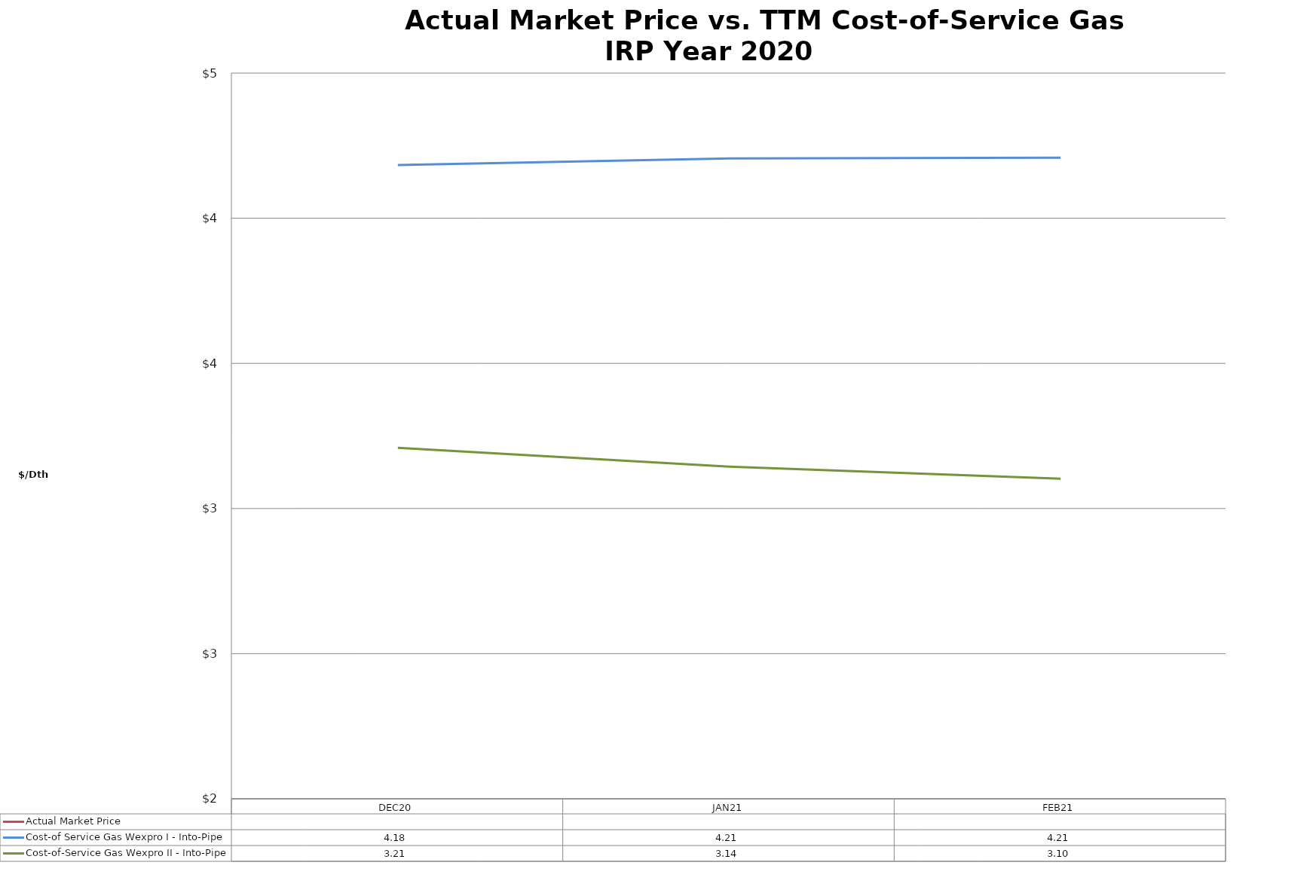
| Category | Actual Market Price | Cost-of Service Gas Wexpro I - Into-Pipe | Cost-of-Service Gas Wexpro II - Into-Pipe |
|---|---|---|---|
| DEC20 |  | 4.183 | 3.209 |
| JAN21 |  | 4.206 | 3.144 |
| FEB21 |  | 4.208 | 3.103 |